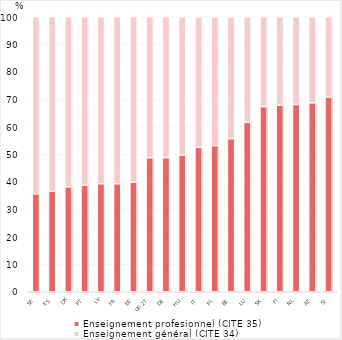
| Category | Enseignement profesionnel (CITE 35) | Enseignement général (CITE 34) |
|---|---|---|
| SE | 35.603 | 64.397 |
| ES | 36.557 | 63.443 |
| DK | 38.168 | 61.832 |
| PT | 38.725 | 61.275 |
| LV | 39.275 | 60.725 |
| FR | 39.281 | 60.719 |
| EE | 39.879 | 60.121 |
| UE-27 | 48.743 | 51.257 |
| DE | 48.76 | 51.24 |
| HU | 49.656 | 50.344 |
| IT | 52.509 | 47.491 |
| PL | 53.136 | 46.864 |
| BE | 55.686 | 44.314 |
| LU | 61.607 | 38.393 |
| SK | 67.334 | 32.666 |
| FI | 67.837 | 32.163 |
| NL | 68.096 | 31.904 |
| AT | 68.708 | 31.292 |
| SI | 70.812 | 29.188 |